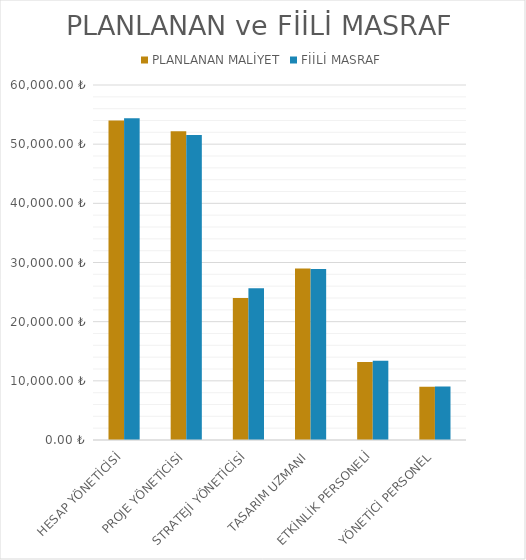
| Category | PLANLANAN MALİYET | FİİLİ MASRAF |
|---|---|---|
| HESAP YÖNETİCİSİ | 54000 | 54360 |
| PROJE YÖNETİCİSİ | 52200 | 51540 |
| STRATEJİ YÖNETİCİSİ | 24000 | 25650 |
| TASARIM UZMANI | 29000 | 28900 |
| ETKİNLİK PERSONELİ | 13200 | 13400 |
| YÖNETİCİ PERSONEL | 9000 | 9060 |